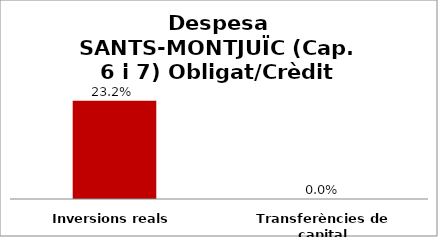
| Category | Series 0 |
|---|---|
| Inversions reals | 0.232 |
| Transferències de capital | 0 |